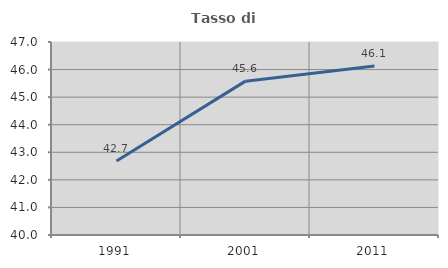
| Category | Tasso di occupazione   |
|---|---|
| 1991.0 | 42.684 |
| 2001.0 | 45.58 |
| 2011.0 | 46.132 |